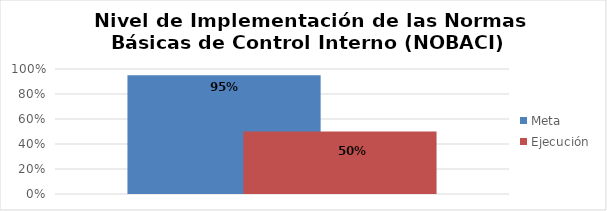
| Category | Meta | Ejecución |
|---|---|---|
| 0 | 0.95 | 0.5 |